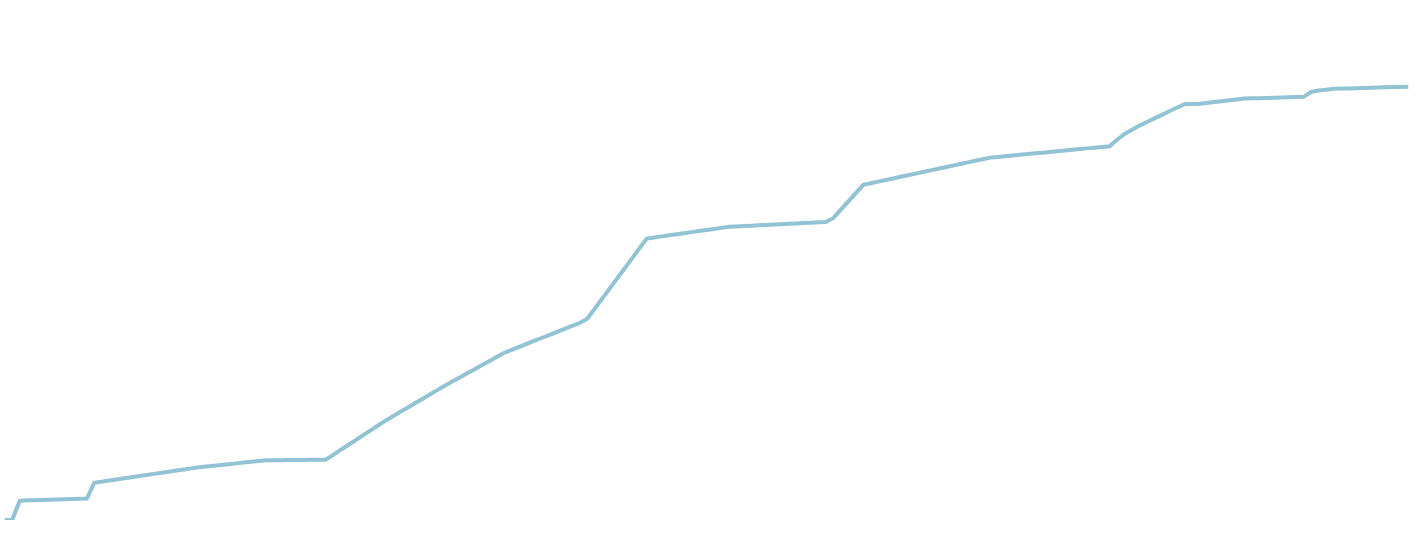
| Category | 0.094 0.452 1.490 2.913 3.908 4.383 9.535 15.625 21.715 27.805 34.143 43.437 52.158 52.266 52.374 52.482 52.590 52.827 57.813 78.451 92.148 97.582 99.944 99.963 99.985 100.00 |
|---|---|
| 0 | 0.003 |
| 1 | 0.005 |
| 2 | 4.387 |
| 3 | 4.531 |
| 4 | 4.581 |
| 5 | 4.631 |
| 6 | 4.681 |
| 7 | 4.731 |
| 8 | 4.781 |
| 9 | 4.831 |
| 10 | 4.881 |
| 11 | 4.931 |
| 12 | 8.603 |
| 13 | 8.858 |
| 14 | 9.113 |
| 15 | 9.368 |
| 16 | 9.623 |
| 17 | 9.878 |
| 18 | 10.133 |
| 19 | 10.388 |
| 20 | 10.643 |
| 21 | 10.898 |
| 22 | 11.153 |
| 23 | 11.408 |
| 24 | 11.663 |
| 25 | 11.918 |
| 26 | 12.171 |
| 27 | 12.35 |
| 28 | 12.529 |
| 29 | 12.708 |
| 30 | 12.887 |
| 31 | 13.066 |
| 32 | 13.245 |
| 33 | 13.424 |
| 34 | 13.603 |
| 35 | 13.778 |
| 36 | 13.796 |
| 37 | 13.814 |
| 38 | 13.832 |
| 39 | 13.85 |
| 40 | 13.868 |
| 41 | 13.886 |
| 42 | 13.904 |
| 43 | 13.918 |
| 44 | 15.046 |
| 45 | 16.173 |
| 46 | 17.3 |
| 47 | 18.427 |
| 48 | 19.554 |
| 49 | 20.681 |
| 50 | 21.808 |
| 51 | 22.935 |
| 52 | 23.948 |
| 53 | 24.961 |
| 54 | 25.974 |
| 55 | 26.987 |
| 56 | 28 |
| 57 | 29.013 |
| 58 | 30.026 |
| 59 | 31.038 |
| 60 | 31.991 |
| 61 | 32.944 |
| 62 | 33.897 |
| 63 | 34.85 |
| 64 | 35.803 |
| 65 | 36.756 |
| 66 | 37.709 |
| 67 | 38.652 |
| 68 | 39.336 |
| 69 | 40.017 |
| 70 | 40.698 |
| 71 | 41.379 |
| 72 | 42.06 |
| 73 | 42.741 |
| 74 | 43.422 |
| 75 | 44.103 |
| 76 | 44.784 |
| 77 | 45.465 |
| 78 | 46.372 |
| 79 | 48.696 |
| 80 | 51.02 |
| 81 | 53.344 |
| 82 | 55.668 |
| 83 | 57.992 |
| 84 | 60.316 |
| 85 | 62.64 |
| 86 | 64.962 |
| 87 | 65.207 |
| 88 | 65.452 |
| 89 | 65.697 |
| 90 | 65.942 |
| 91 | 66.187 |
| 92 | 66.432 |
| 93 | 66.677 |
| 94 | 66.922 |
| 95 | 67.167 |
| 96 | 67.412 |
| 97 | 67.657 |
| 98 | 67.744 |
| 99 | 67.831 |
| 100 | 67.918 |
| 101 | 68.005 |
| 102 | 68.092 |
| 103 | 68.179 |
| 104 | 68.266 |
| 105 | 68.353 |
| 106 | 68.44 |
| 107 | 68.527 |
| 108 | 68.614 |
| 109 | 68.701 |
| 110 | 68.787 |
| 111 | 69.713 |
| 112 | 71.622 |
| 113 | 73.529 |
| 114 | 75.436 |
| 115 | 77.343 |
| 116 | 77.713 |
| 117 | 78.083 |
| 118 | 78.453 |
| 119 | 78.823 |
| 120 | 79.193 |
| 121 | 79.563 |
| 122 | 79.933 |
| 123 | 80.303 |
| 124 | 80.673 |
| 125 | 81.043 |
| 126 | 81.413 |
| 127 | 81.783 |
| 128 | 82.153 |
| 129 | 82.523 |
| 130 | 82.893 |
| 131 | 83.263 |
| 132 | 83.624 |
| 133 | 83.791 |
| 134 | 83.955 |
| 135 | 84.119 |
| 136 | 84.283 |
| 137 | 84.447 |
| 138 | 84.611 |
| 139 | 84.775 |
| 140 | 84.939 |
| 141 | 85.103 |
| 142 | 85.267 |
| 143 | 85.431 |
| 144 | 85.595 |
| 145 | 85.759 |
| 146 | 85.923 |
| 147 | 86.087 |
| 148 | 86.251 |
| 149 | 87.764 |
| 150 | 89.096 |
| 151 | 90.059 |
| 152 | 91.021 |
| 153 | 91.846 |
| 154 | 92.671 |
| 155 | 93.496 |
| 156 | 94.321 |
| 157 | 95.146 |
| 158 | 95.971 |
| 159 | 96.009 |
| 160 | 96.045 |
| 161 | 96.247 |
| 162 | 96.448 |
| 163 | 96.649 |
| 164 | 96.85 |
| 165 | 97.051 |
| 166 | 97.252 |
| 167 | 97.302 |
| 168 | 97.352 |
| 169 | 97.402 |
| 170 | 97.452 |
| 171 | 97.502 |
| 172 | 97.552 |
| 173 | 97.602 |
| 174 | 97.65 |
| 175 | 98.799 |
| 176 | 99.105 |
| 177 | 99.302 |
| 178 | 99.498 |
| 179 | 99.55 |
| 180 | 99.6 |
| 181 | 99.65 |
| 182 | 99.7 |
| 183 | 99.75 |
| 184 | 99.8 |
| 185 | 99.85 |
| 186 | 99.9 |
| 187 | 99.95 |
| 188 | 100 |